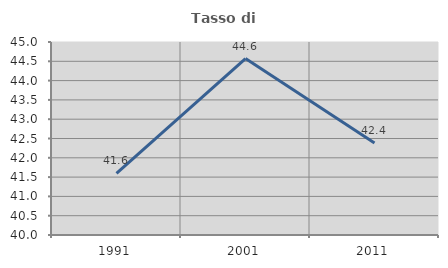
| Category | Tasso di occupazione   |
|---|---|
| 1991.0 | 41.598 |
| 2001.0 | 44.572 |
| 2011.0 | 42.383 |